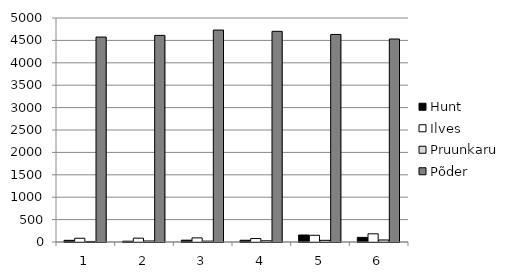
| Category | Hunt | Ilves | Pruunkaru | Põder |
|---|---|---|---|---|
| 1.0 | 37 | 84 | 12 | 4575 |
| 2.0 | 18 | 86 | 23 | 4612 |
| 3.0 | 41 | 92 | 20 | 4731 |
| 4.0 | 39 | 77 | 27 | 4703 |
| 5.0 | 156 | 150 | 37 | 4633 |
| 6.0 | 103 | 183 | 45 | 4531 |